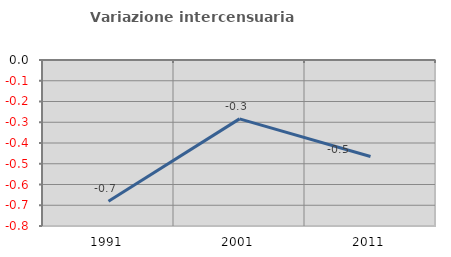
| Category | Variazione intercensuaria annua |
|---|---|
| 1991.0 | -0.68 |
| 2001.0 | -0.284 |
| 2011.0 | -0.465 |